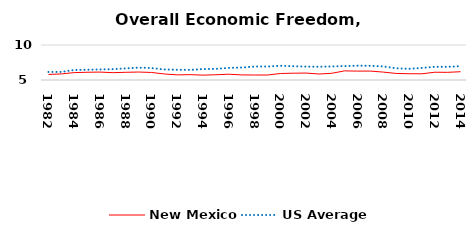
| Category | New Mexico | US Average |
|---|---|---|
| 1982.0 | 5.788 | 6.149 |
| 1983.0 | 5.871 | 6.152 |
| 1984.0 | 6.054 | 6.429 |
| 1985.0 | 6.106 | 6.464 |
| 1986.0 | 6.131 | 6.512 |
| 1987.0 | 6.047 | 6.552 |
| 1988.0 | 6.1 | 6.659 |
| 1989.0 | 6.138 | 6.767 |
| 1990.0 | 6.077 | 6.71 |
| 1991.0 | 5.861 | 6.502 |
| 1992.0 | 5.733 | 6.463 |
| 1993.0 | 5.765 | 6.446 |
| 1994.0 | 5.696 | 6.563 |
| 1995.0 | 5.752 | 6.593 |
| 1996.0 | 5.828 | 6.73 |
| 1997.0 | 5.729 | 6.781 |
| 1998.0 | 5.713 | 6.926 |
| 1999.0 | 5.709 | 6.925 |
| 2000.0 | 5.924 | 7.031 |
| 2001.0 | 5.973 | 6.969 |
| 2002.0 | 5.99 | 6.912 |
| 2003.0 | 5.856 | 6.892 |
| 2004.0 | 5.959 | 6.934 |
| 2005.0 | 6.305 | 6.99 |
| 2006.0 | 6.269 | 7.048 |
| 2007.0 | 6.274 | 7.028 |
| 2008.0 | 6.129 | 6.935 |
| 2009.0 | 5.936 | 6.668 |
| 2010.0 | 5.895 | 6.605 |
| 2011.0 | 5.885 | 6.72 |
| 2012.0 | 6.108 | 6.883 |
| 2013.0 | 6.096 | 6.881 |
| 2014.0 | 6.181 | 6.973 |